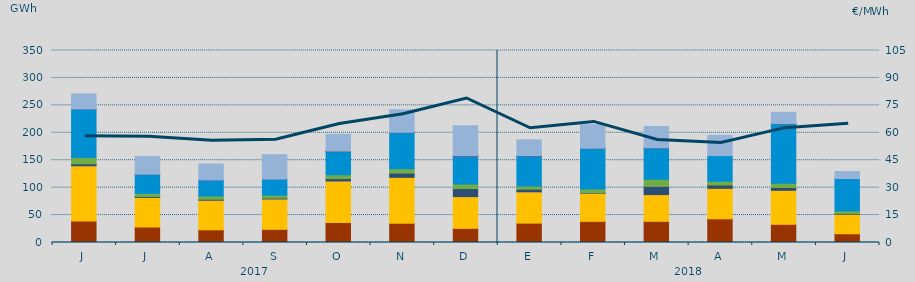
| Category | Carbón | Ciclo Combinado | Cogeneración | Consumo Bombeo | Eólica | Fuel-Gas | Hidráulica | Nuclear | Otras Renovables | Turbinación bombeo |
|---|---|---|---|---|---|---|---|---|---|---|
| J | 39223.4 | 100710.5 | 17.3 | 3498.8 | 11518.7 | 0 | 88256.3 | 69.8 | 0 | 27501.3 |
| J | 28227.7 | 53992.1 | 2.7 | 1736.9 | 5554.8 | 0 | 34688.7 | 310 | 0 | 32397.1 |
| A | 23185.3 | 53888.3 | 1.1 | 1823.4 | 5883.3 | 0 | 29023.6 | 148 | 0 | 29140 |
| S | 23990.4 | 55429.2 | 0.8 | 1551.4 | 5247.3 | 0 | 29358.5 | 3.1 | 0 | 44532.5 |
| O | 36235.6 | 75955.4 | 2 | 4285.9 | 7050.1 | 0 | 42190.9 | 700 | 131.3 | 30549.8 |
| N | 35124.9 | 83653.4 | 0 | 7774.4 | 7943.5 | 0 | 66112.3 | 0 | 299.1 | 41077.1 |
| D | 25784.6 | 57877.3 | 0 | 14602.9 | 8236.4 | 0 | 50297.7 | 1085.4 | 57.5 | 54906.6 |
| E | 35353.2 | 57056.1 | 10.8 | 4781.6 | 5669.6 | 0 | 55012.6 | 282.3 | 69.8 | 28937.8 |
| F | 38501.6 | 51366.4 | 3 | 876.5 | 6719.4 | 0 | 74091.8 | 129.7 | 8.1 | 42931.7 |
| M | 38546.8 | 48796.7 | 0 | 14986.9 | 13034.1 | 0 | 57129.4 | 0 | 7.9 | 39005.1 |
| A | 43196.7 | 55522.2 | 0 | 6134.1 | 6758.4 | 0 | 46798.3 | 0 | 0 | 36861.2 |
| M | 33193.7 | 61920.1 | 0 | 5137.4 | 7808.1 | 0 | 108282.8 | 306.6 | 16.5 | 20554.6 |
| J | 15935.3 | 35519.8 | 0 | 1509.9 | 4554.3 | 0 | 58954.4 | 75 | 0 | 12771.1 |